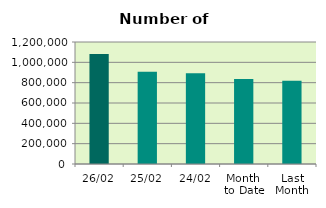
| Category | Series 0 |
|---|---|
| 26/02 | 1081454 |
| 25/02 | 907600 |
| 24/02 | 891810 |
| Month 
to Date | 836497.7 |
| Last
Month | 819236.4 |